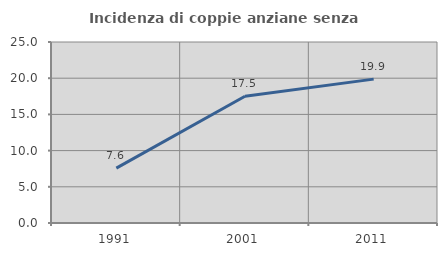
| Category | Incidenza di coppie anziane senza figli  |
|---|---|
| 1991.0 | 7.586 |
| 2001.0 | 17.5 |
| 2011.0 | 19.872 |